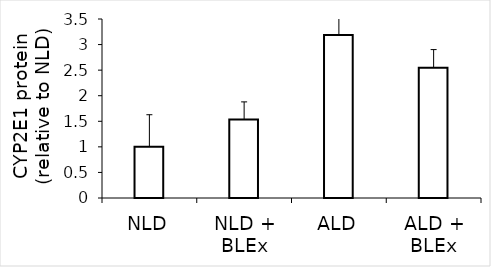
| Category | Series 0 |
|---|---|
| NLD | 1 |
| NLD + BLEx | 1.536 |
| ALD | 3.185 |
| ALD + BLEx | 2.549 |